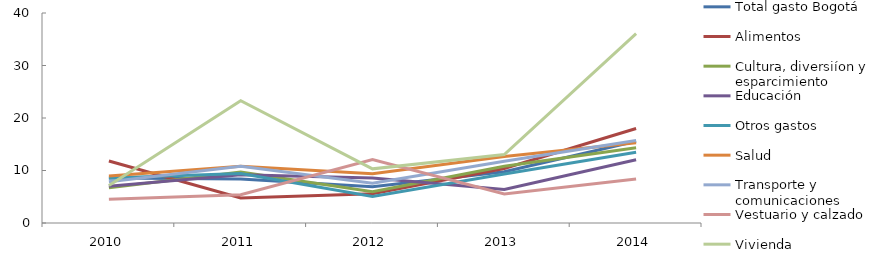
| Category | Total gasto Bogotá | Alimentos | Cultura, diversiíon y esparcimiento | Educación | Otros gastos | Salud | Transporte y comunicaciones | Vestuario y calzado | Vivienda |
|---|---|---|---|---|---|---|---|---|---|
| 2010.0 | 8.582 | 11.81 | 6.729 | 7.009 | 8.558 | 8.97 | 7.867 | 4.51 | 7.129 |
| 2011.0 | 8.361 | 4.765 | 9.691 | 9.207 | 9.432 | 10.831 | 10.805 | 5.381 | 23.288 |
| 2012.0 | 6.885 | 5.556 | 5.977 | 8.576 | 5.069 | 9.396 | 7.563 | 12.091 | 10.315 |
| 2013.0 | 9.776 | 10.391 | 10.818 | 6.366 | 9.34 | 12.682 | 11.756 | 5.516 | 13.034 |
| 2014.0 | 15.571 | 18 | 14.348 | 12.032 | 13.462 | 15.294 | 15.705 | 8.376 | 36.061 |